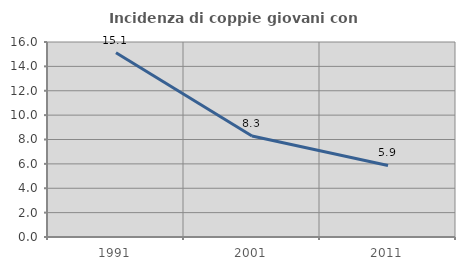
| Category | Incidenza di coppie giovani con figli |
|---|---|
| 1991.0 | 15.122 |
| 2001.0 | 8.28 |
| 2011.0 | 5.873 |